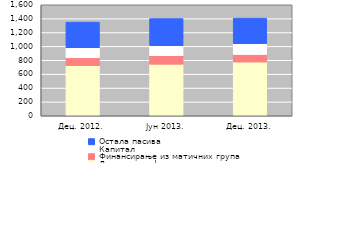
| Category | Депозити нефинан. сектора | Финансирање из матичних група | Капитал | Остала пасива |
|---|---|---|---|---|
| Дец. 2012. | 724 | 111 | 146.542 | 368.655 |
| Јун 2013. | 744.1 | 120.4 | 145.358 | 391.391 |
| Дец. 2013. | 775.4 | 109 | 153.897 | 368.887 |